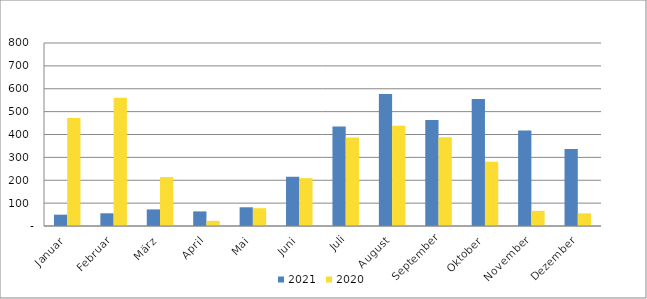
| Category | 2021 | 2020 |
|---|---|---|
| Januar | 49457 | 472173 |
| Februar | 55552 | 560787 |
| März | 72514 | 213906 |
| April | 63848 | 22459 |
| Mai | 81815 | 77962 |
| Juni | 215277 | 209142 |
| Juli | 435393 | 386989 |
| August | 577519 | 438253 |
| September | 463461 | 387576 |
| Oktober | 554843 | 281113 |
| November | 417558 | 66272 |
| Dezember | 336410 | 55430 |